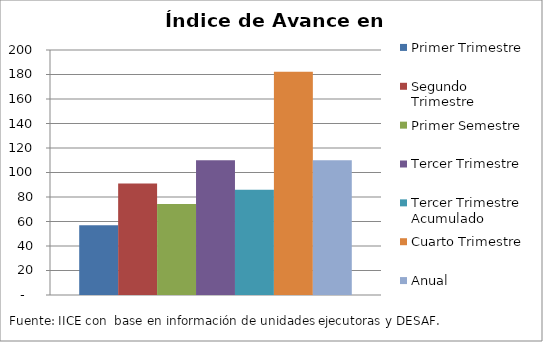
| Category | Primer Trimestre | Segundo Trimestre | Primer Semestre | Tercer Trimestre | Tercer Trimestre Acumulado | Cuarto Trimestre | Anual |
|---|---|---|---|---|---|---|---|
| 0 | 57.012 | 91.091 | 74.261 | 109.927 | 85.923 | 182.191 | 109.99 |